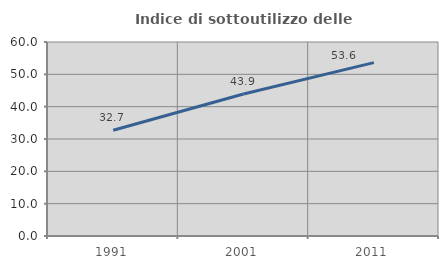
| Category | Indice di sottoutilizzo delle abitazioni  |
|---|---|
| 1991.0 | 32.71 |
| 2001.0 | 43.937 |
| 2011.0 | 53.616 |